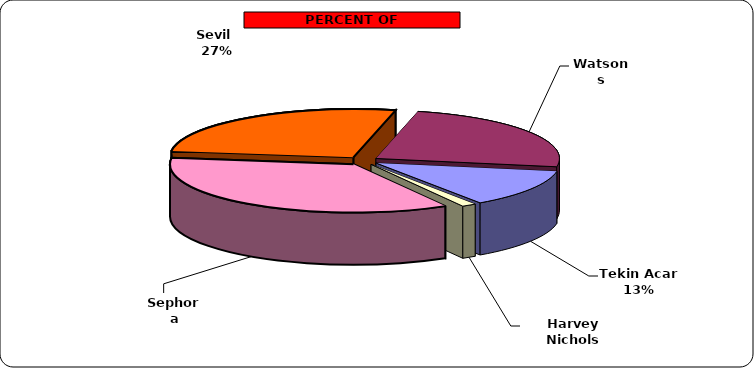
| Category | Series 0 |
|---|---|
| Sephora | 28 |
| Sevil  | 21 |
| Watsons | 19 |
| Tekin Acar  | 10 |
| Harvey Nichols | 1 |